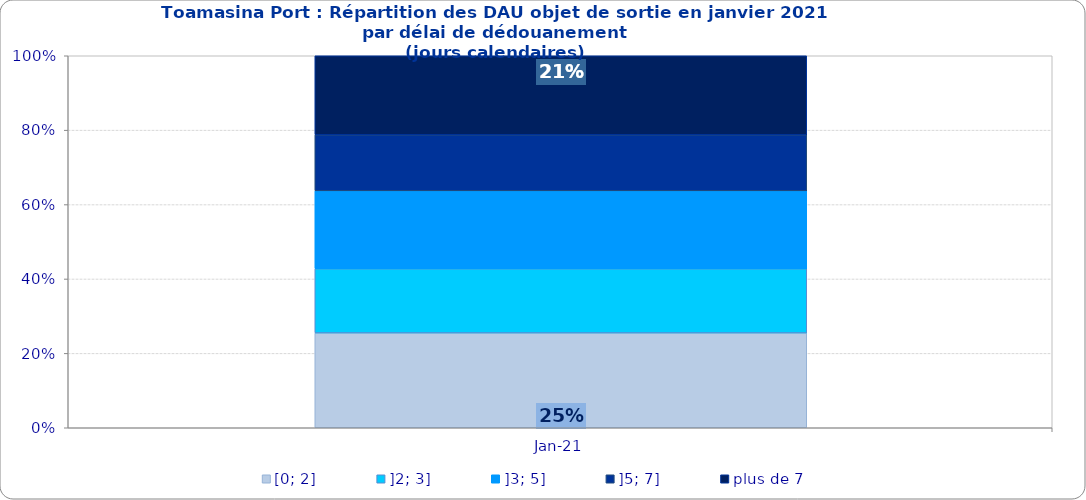
| Category | [0; 2] | ]2; 3] | ]3; 5] | ]5; 7] | plus de 7 |
|---|---|---|---|---|---|
| 2021-01-01 | 0.255 | 0.173 | 0.209 | 0.151 | 0.213 |